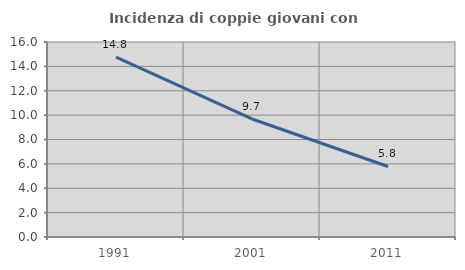
| Category | Incidenza di coppie giovani con figli |
|---|---|
| 1991.0 | 14.752 |
| 2001.0 | 9.684 |
| 2011.0 | 5.786 |